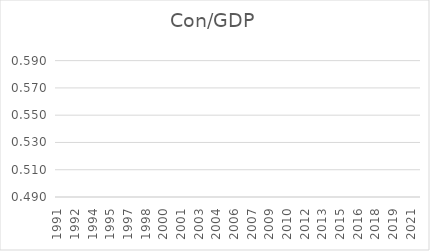
| Category | Con/GDP |
|---|---|
| 1991.0 | 0 |
| 1991.0 | 0 |
| 1991.0 | 0 |
| 1991.0 | 0 |
| 1992.0 | 0 |
| 1992.0 | 0 |
| 1992.0 | 0 |
| 1992.0 | 0 |
| 1993.0 | 0 |
| 1993.0 | 0 |
| 1993.0 | 0 |
| 1993.0 | 0 |
| 1994.0 | 0 |
| 1994.0 | 0 |
| 1994.0 | 0 |
| 1994.0 | 0 |
| 1995.0 | 0 |
| 1995.0 | 0 |
| 1995.0 | 0 |
| 1995.0 | 0 |
| 1996.0 | 0 |
| 1996.0 | 0 |
| 1996.0 | 0 |
| 1996.0 | 0 |
| 1997.0 | 0 |
| 1997.0 | 0 |
| 1997.0 | 0 |
| 1997.0 | 0 |
| 1998.0 | 0 |
| 1998.0 | 0 |
| 1998.0 | 0 |
| 1998.0 | 0 |
| 1999.0 | 0 |
| 1999.0 | 0 |
| 1999.0 | 0 |
| 1999.0 | 0 |
| 2000.0 | 0 |
| 2000.0 | 0 |
| 2000.0 | 0 |
| 2000.0 | 0 |
| 2001.0 | 0 |
| 2001.0 | 0 |
| 2001.0 | 0 |
| 2001.0 | 0 |
| 2002.0 | 0 |
| 2002.0 | 0 |
| 2002.0 | 0 |
| 2002.0 | 0 |
| 2003.0 | 0 |
| 2003.0 | 0 |
| 2003.0 | 0 |
| 2003.0 | 0 |
| 2004.0 | 0 |
| 2004.0 | 0 |
| 2004.0 | 0 |
| 2004.0 | 0 |
| 2005.0 | 0 |
| 2005.0 | 0 |
| 2005.0 | 0 |
| 2005.0 | 0 |
| 2006.0 | 0 |
| 2006.0 | 0 |
| 2006.0 | 0 |
| 2006.0 | 0 |
| 2007.0 | 0 |
| 2007.0 | 0 |
| 2007.0 | 0 |
| 2007.0 | 0 |
| 2008.0 | 0 |
| 2008.0 | 0 |
| 2008.0 | 0 |
| 2008.0 | 0 |
| 2009.0 | 0 |
| 2009.0 | 0 |
| 2009.0 | 0 |
| 2009.0 | 0 |
| 2010.0 | 0 |
| 2010.0 | 0 |
| 2010.0 | 0 |
| 2010.0 | 0 |
| 2011.0 | 0 |
| 2011.0 | 0 |
| 2011.0 | 0 |
| 2011.0 | 0 |
| 2012.0 | 0 |
| 2012.0 | 0 |
| 2012.0 | 0 |
| 2012.0 | 0 |
| 2013.0 | 0 |
| 2013.0 | 0 |
| 2013.0 | 0 |
| 2013.0 | 0 |
| 2014.0 | 0 |
| 2014.0 | 0 |
| 2014.0 | 0 |
| 2014.0 | 0 |
| 2015.0 | 0 |
| 2015.0 | 0 |
| 2015.0 | 0 |
| 2015.0 | 0 |
| 2016.0 | 0 |
| 2016.0 | 0 |
| 2016.0 | 0 |
| 2016.0 | 0 |
| 2017.0 | 0 |
| 2017.0 | 0 |
| 2017.0 | 0 |
| 2017.0 | 0 |
| 2018.0 | 0 |
| 2018.0 | 0 |
| 2018.0 | 0 |
| 2018.0 | 0 |
| 2019.0 | 0 |
| 2019.0 | 0 |
| 2019.0 | 0 |
| 2019.0 | 0 |
| 2020.0 | 0 |
| 2020.0 | 0 |
| 2020.0 | 0 |
| 2020.0 | 0 |
| 2021.0 | 0 |
| 2021.0 | 0 |
| 2021.0 | 0 |
| 2021.0 | 0 |